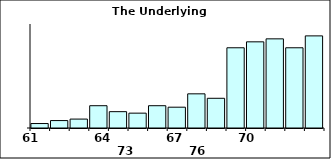
| Category | Series 0 |
|---|---|
| 61.0 | 3 |
| 62.0 | 5 |
| 63.0 | 6 |
| 64.0 | 15 |
| 65.0 | 11 |
| 66.0 | 10 |
| 67.0 | 15 |
| 68.0 | 14 |
| 69.0 | 23 |
| 70.0 | 20 |
| 71.0 | 54 |
| 72.0 | 58 |
| 73.0 | 60 |
| 74.0 | 54 |
| 75.0 | 62 |